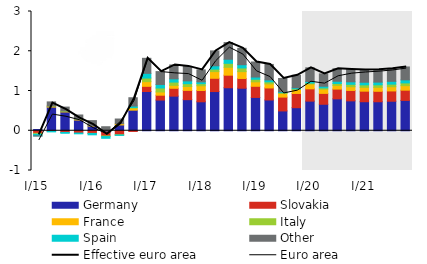
| Category | Germany | Slovakia | France | Italy | Spain | Other |
|---|---|---|---|---|---|---|
| I/15 | 0.032 | -0.063 | -0.016 | -0.007 | -0.042 | -0.005 |
| II | 0.595 | -0.015 | 0.021 | 0.007 | -0.013 | 0.103 |
| III | 0.473 | -0.043 | 0.009 | 0.017 | -0.021 | 0.096 |
| IV | 0.269 | -0.058 | 0.015 | 0.01 | -0.019 | 0.102 |
| I/16 | 0.117 | -0.066 | 0.007 | -0.002 | -0.034 | 0.131 |
| II | -0.04 | -0.091 | 0.007 | -0.016 | -0.044 | 0.095 |
| III | 0.146 | -0.102 | 0.032 | -0.005 | -0.01 | 0.118 |
| IV | 0.518 | -0.017 | 0.053 | 0.015 | 0.036 | 0.209 |
| I/17 | 0.987 | 0.131 | 0.118 | 0.09 | 0.118 | 0.378 |
| II | 0.772 | 0.122 | 0.082 | 0.1 | 0.089 | 0.324 |
| III | 0.871 | 0.197 | 0.074 | 0.083 | 0.081 | 0.349 |
| IV | 0.782 | 0.234 | 0.097 | 0.072 | 0.07 | 0.364 |
| I/18 | 0.729 | 0.284 | 0.119 | 0.052 | 0.046 | 0.301 |
| II | 0.986 | 0.334 | 0.168 | 0.062 | 0.083 | 0.375 |
| III | 1.082 | 0.316 | 0.199 | 0.1 | 0.102 | 0.419 |
| IV | 1.07 | 0.246 | 0.172 | 0.093 | 0.082 | 0.412 |
| I/19 | 0.838 | 0.281 | 0.112 | 0.065 | 0.055 | 0.379 |
| II | 0.774 | 0.303 | 0.102 | 0.051 | 0.048 | 0.389 |
| III | 0.498 | 0.348 | 0.094 | 0.018 | 0.02 | 0.335 |
| IV | 0.58 | 0.358 | 0.099 | 0.018 | 0.025 | 0.315 |
| I/20 | 0.745 | 0.31 | 0.12 | 0.025 | 0.04 | 0.344 |
| II | 0.666 | 0.274 | 0.107 | 0.032 | 0.041 | 0.311 |
| III | 0.803 | 0.245 | 0.094 | 0.047 | 0.056 | 0.316 |
| IV | 0.752 | 0.262 | 0.093 | 0.061 | 0.063 | 0.312 |
| I/21 | 0.73 | 0.266 | 0.096 | 0.064 | 0.065 | 0.31 |
| II | 0.73 | 0.263 | 0.1 | 0.063 | 0.067 | 0.31 |
| III | 0.743 | 0.259 | 0.106 | 0.064 | 0.071 | 0.316 |
| IV | 0.763 | 0.258 | 0.114 | 0.069 | 0.076 | 0.325 |